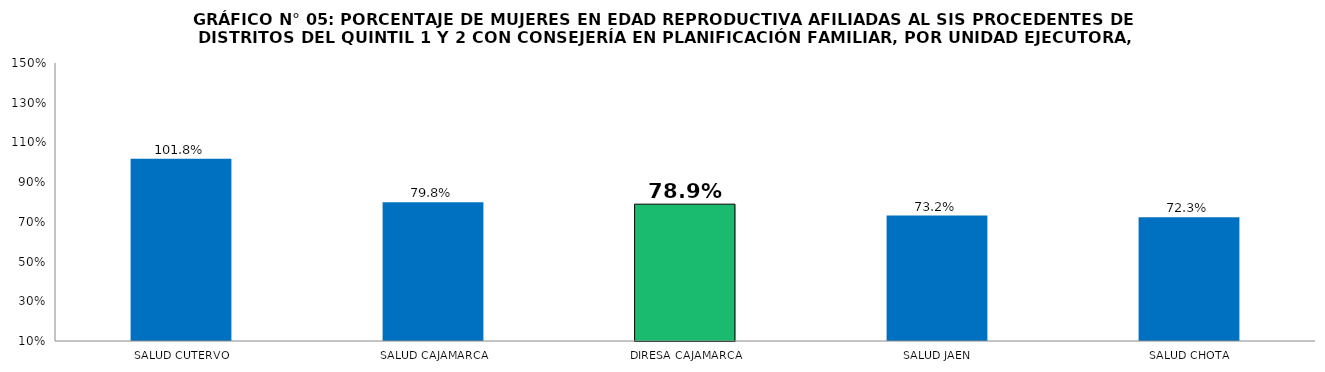
| Category | % AFILIADAS CON CONSEJERÍA EN PPFF 
(QUINTIL 1 y 2) |
|---|---|
| SALUD CUTERVO | 1.018 |
| SALUD CAJAMARCA | 0.798 |
| DIRESA CAJAMARCA | 0.789 |
| SALUD JAEN | 0.732 |
| SALUD CHOTA | 0.723 |